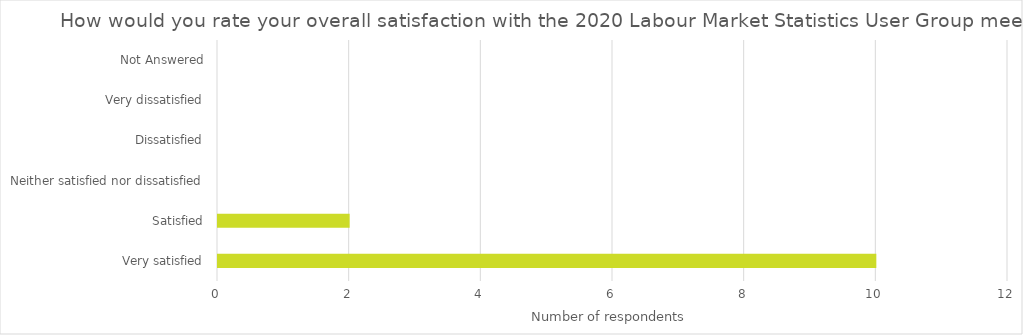
| Category | Total |
|---|---|
| Very satisfied | 10 |
| Satisfied | 2 |
| Neither satisfied nor dissatisfied | 0 |
| Dissatisfied | 0 |
| Very dissatisfied | 0 |
| Not Answered | 0 |